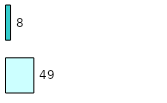
| Category | Series 0 | Series 1 |
|---|---|---|
| 0 | 49 | 8 |